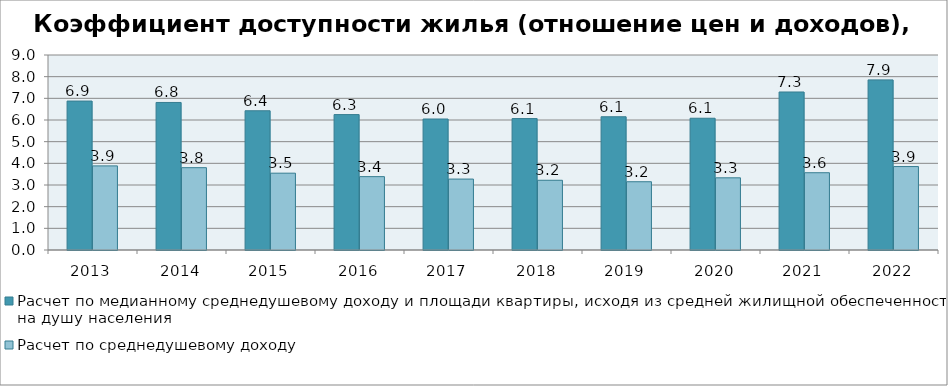
| Category | Расчет по медианному среднедушевому доходу и площади квартиры, исходя из средней жилищной обеспеченности на душу населения | Расчет по среднедушевому доходу |
|---|---|---|
| 2013 | 6.875 | 3.883 |
| 2014 | 6.809 | 3.8 |
| 2015 | 6.426 | 3.546 |
| 2016 | 6.25 | 3.386 |
| 2017 | 6.046 | 3.274 |
| 2018 | 6.066 | 3.218 |
| 2019 | 6.15 | 3.15 |
| 2020 | 6.081 | 3.332 |
| 2021 | 7.293 | 3.567 |
| 2022 | 7.851 | 3.851 |